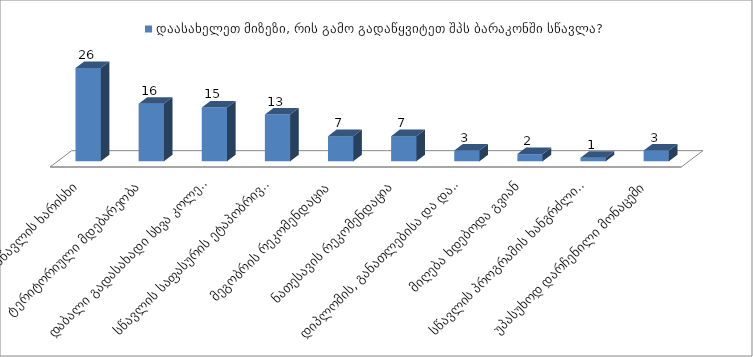
| Category | დაასახელეთ მიზეზი, რის გამო გადაწყვიტეთ შპს ბარაკონში სწავლა? |
|---|---|
| სწავლის ხარისხი | 26 |
| ტერიტორიული მდებარეობა | 16 |
| დაბალი გადასახადი სხვა კოლეჯებთან შედარებით | 15 |
| სწავლის საფასურის ეტაპობრივი გადახდა | 13 |
| მეგობრის რეკომენდაცია | 7 |
| ნათესავის რეკომენდაცია | 7 |
| დიპლომის, განათლებისა და დასაქმების გამო | 3 |
| მიღება ხდებოდა გვიან | 2 |
| სწავლის პროგრამის ხანგრძლივობიდან გამომდინარე | 1 |
|  უპასუხოდ დარჩენილი მონაცემი | 3 |